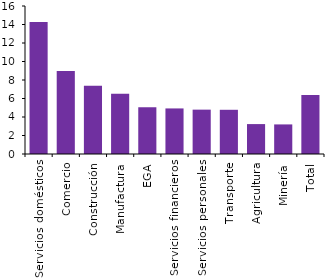
| Category | Series 0 |
|---|---|
| Servicios domésticos | 14.263 |
| Comercio | 8.97 |
| Construcción | 7.368 |
| Manufactura | 6.52 |
| EGA | 5.054 |
| Servicios financieros | 4.926 |
| Servicios personales | 4.795 |
| Transporte | 4.779 |
| Agricultura | 3.234 |
| Minería | 3.199 |
| Total | 6.381 |